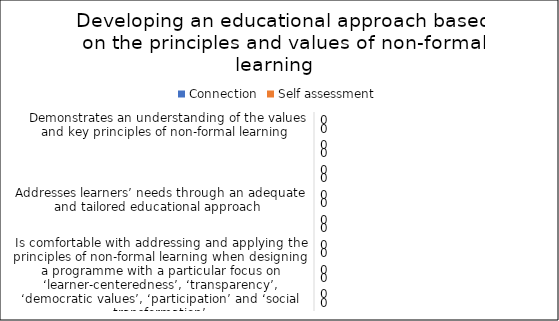
| Category | Connection | Self assessment |
|---|---|---|
| Demonstrates an understanding of the values and key principles of non-formal learning  | 0 | 0 |
| Demonstrates an understanding of different educational methods and concepts for needs assessment  | 0 | 0 |
| Assesses learners’ needs before or at the very beginning of the training activity | 0 | 0 |
| Addresses learners’ needs through an adequate and tailored educational approach  | 0 | 0 |
| Makes adjustments if necessary | 0 | 0 |
| Is comfortable with having a flexible and adjustable programme | 0 | 0 |
| Is comfortable with addressing and applying the principles of non-formal learning when designing a programme with a particular focus on ‘learner-centeredness’, ‘transparency’, ‘democratic values’, ‘participation’ and ‘social transformation’ | 0 | 0 |
| Demonstrates a genuine interest in learners’ needs  | 0 | 0 |